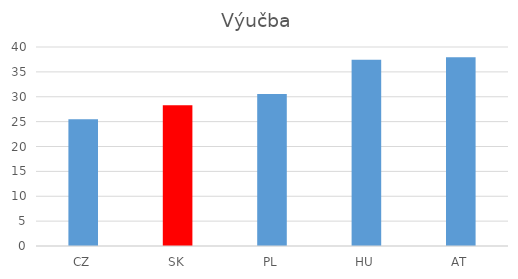
| Category | Výučba |
|---|---|
| CZ | 25.5 |
| SK | 28.3 |
| PL | 30.533 |
| HU | 37.433 |
| AT | 37.933 |